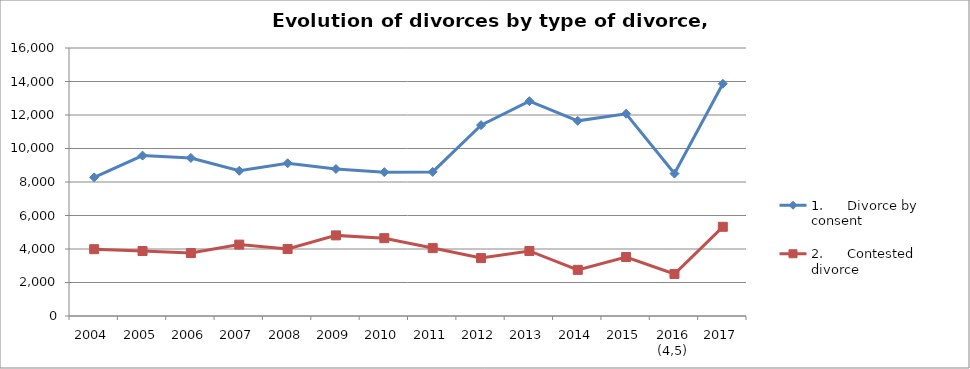
| Category | 1.      Divorce by consent | 2.      Contested divorce |
|---|---|---|
| 2004 | 8276 | 3988 |
| 2005 | 9575 | 3879 |
| 2006 | 9436 | 3758 |
| 2007 | 8671 | 4262 |
| 2008 | 9118 | 3999 |
| 2009 | 8777 | 4813 |
| 2010 | 8589 | 4647 |
| 2011 | 8602 | 4055 |
| 2012 | 11395 | 3458 |
| 2013 | 12823 | 3883 |
| 2014 | 11651 | 2755 |
| 2015 | 12075 | 3519 |
| 2016 (4,5) | 8504 | 2509 |
| 2017 | 13865 | 5325 |